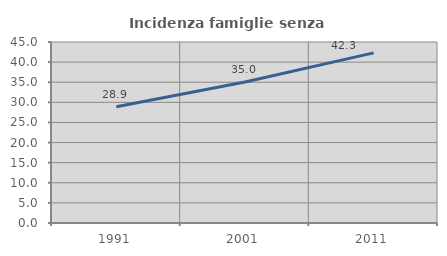
| Category | Incidenza famiglie senza nuclei |
|---|---|
| 1991.0 | 28.922 |
| 2001.0 | 35.05 |
| 2011.0 | 42.293 |